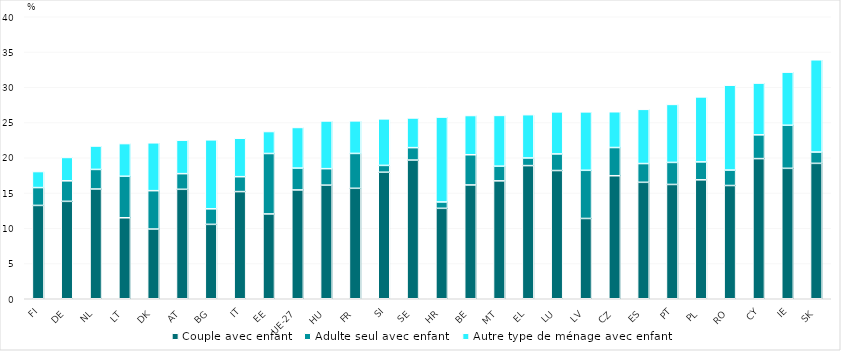
| Category | Couple avec enfant | Adulte seul avec enfant  | Autre type de ménage avec enfant |
|---|---|---|---|
| FI | 13.24 | 2.53 | 2.271 |
| DE | 13.818 | 2.911 | 3.313 |
| NL | 15.568 | 2.778 | 3.317 |
| LT | 11.488 | 5.887 | 4.636 |
| DK | 9.888 | 5.442 | 6.792 |
| AT | 15.527 | 2.217 | 4.75 |
| BG | 10.554 | 2.205 | 9.783 |
| IT | 15.2 | 2.114 | 5.454 |
| EE | 12.031 | 8.573 | 3.117 |
| UE-27 | 15.436 | 3.098 | 5.762 |
| HU | 16.113 | 2.339 | 6.767 |
| FR | 15.669 | 4.943 | 4.622 |
| SI | 17.948 | 0.968 | 6.601 |
| SE | 19.674 | 1.762 | 4.208 |
| HR | 12.829 | 0.9 | 12.037 |
| BE | 16.142 | 4.285 | 5.565 |
| MT | 16.722 | 2.084 | 7.2 |
| EL | 18.887 | 1.083 | 6.141 |
| LU | 18.189 | 2.356 | 5.965 |
| LV | 11.388 | 6.831 | 8.292 |
| CZ | 17.449 | 4.001 | 5.076 |
| ES | 16.518 | 2.659 | 7.692 |
| PT | 16.214 | 3.125 | 8.228 |
| PL | 16.87 | 2.542 | 9.221 |
| RO | 16.063 | 2.192 | 12.038 |
| CY | 19.88 | 3.37 | 7.341 |
| IE | 18.502 | 6.107 | 7.536 |
| SK | 19.205 | 1.604 | 13.088 |